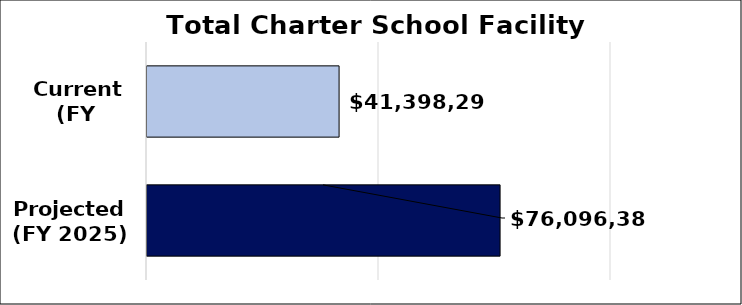
| Category | Total facility gap |
|---|---|
|  Current
(FY 2020) | 41398293.12 |
| Projected
(FY 2025) | 76096386.602 |